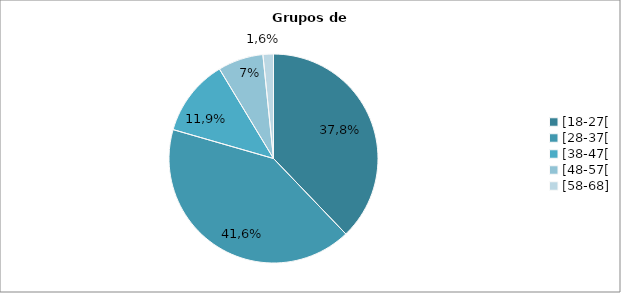
| Category | grupos de idades |
|---|---|
| [18-27[ | 37.838 |
| [28-37[ | 41.622 |
| [38-47[ | 11.892 |
| [48-57[ | 7.027 |
| [58-68] | 1.622 |